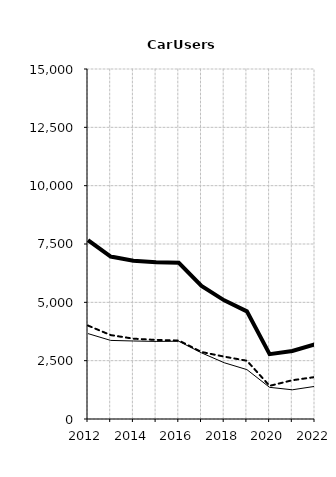
| Category | Built-up | Non built-up | Total |
|---|---|---|---|
| 2012.0 | 3660 | 4005 | 7665 |
| 2013.0 | 3368 | 3596 | 6964 |
| 2014.0 | 3343 | 3443 | 6786 |
| 2015.0 | 3325 | 3388 | 6713 |
| 2016.0 | 3332 | 3365 | 6697 |
| 2017.0 | 2835 | 2872 | 5707 |
| 2018.0 | 2412 | 2673 | 5085 |
| 2019.0 | 2117 | 2497 | 4614 |
| 2020.0 | 1357 | 1421 | 2778 |
| 2021.0 | 1252 | 1661 | 2913 |
| 2022.0 | 1400 | 1798 | 3198 |